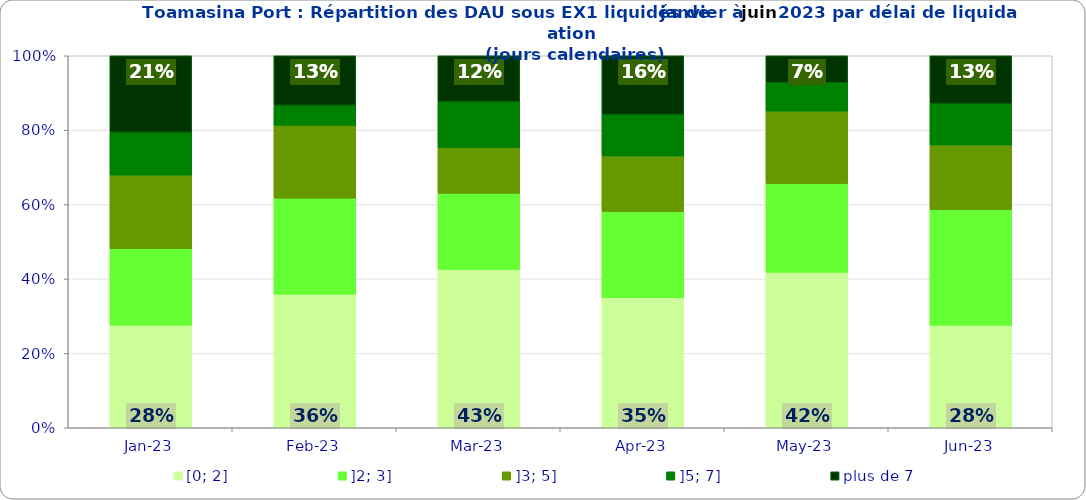
| Category | [0; 2] | ]2; 3] | ]3; 5] | ]5; 7] | plus de 7 |
|---|---|---|---|---|---|
| 2023-01-01 | 0.276 | 0.206 | 0.198 | 0.115 | 0.206 |
| 2023-02-01 | 0.359 | 0.258 | 0.196 | 0.054 | 0.133 |
| 2023-03-01 | 0.426 | 0.204 | 0.123 | 0.125 | 0.123 |
| 2023-04-01 | 0.349 | 0.232 | 0.149 | 0.112 | 0.158 |
| 2023-05-01 | 0.418 | 0.239 | 0.195 | 0.076 | 0.073 |
| 2023-06-01 | 0.275 | 0.311 | 0.174 | 0.111 | 0.128 |